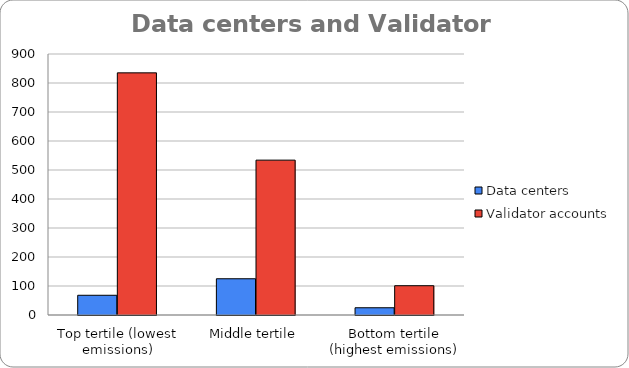
| Category | Data centers | Validator accounts |
|---|---|---|
| Top tertile (lowest emissions) | 68 | 835 |
| Middle tertile | 125 | 534 |
| Bottom tertile (highest emissions) | 25 | 101 |